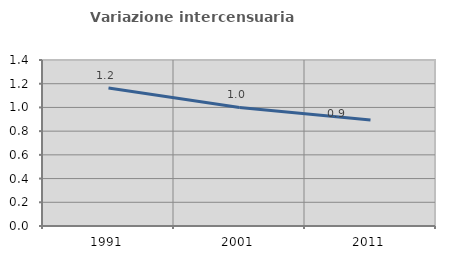
| Category | Variazione intercensuaria annua |
|---|---|
| 1991.0 | 1.163 |
| 2001.0 | 1 |
| 2011.0 | 0.894 |